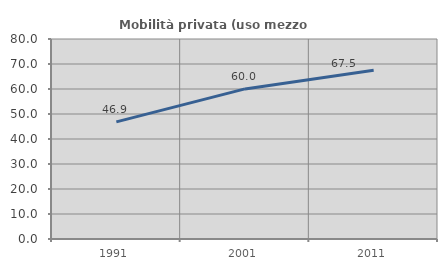
| Category | Mobilità privata (uso mezzo privato) |
|---|---|
| 1991.0 | 46.861 |
| 2001.0 | 60.042 |
| 2011.0 | 67.461 |